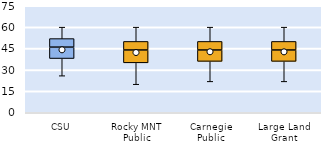
| Category | 25th | 50th | 75th |
|---|---|---|---|
| CSU | 38 | 8 | 6 |
| Rocky MNT Public | 35 | 9 | 6 |
| Carnegie Public | 36 | 8 | 6 |
| Large Land Grant | 36 | 8 | 6 |